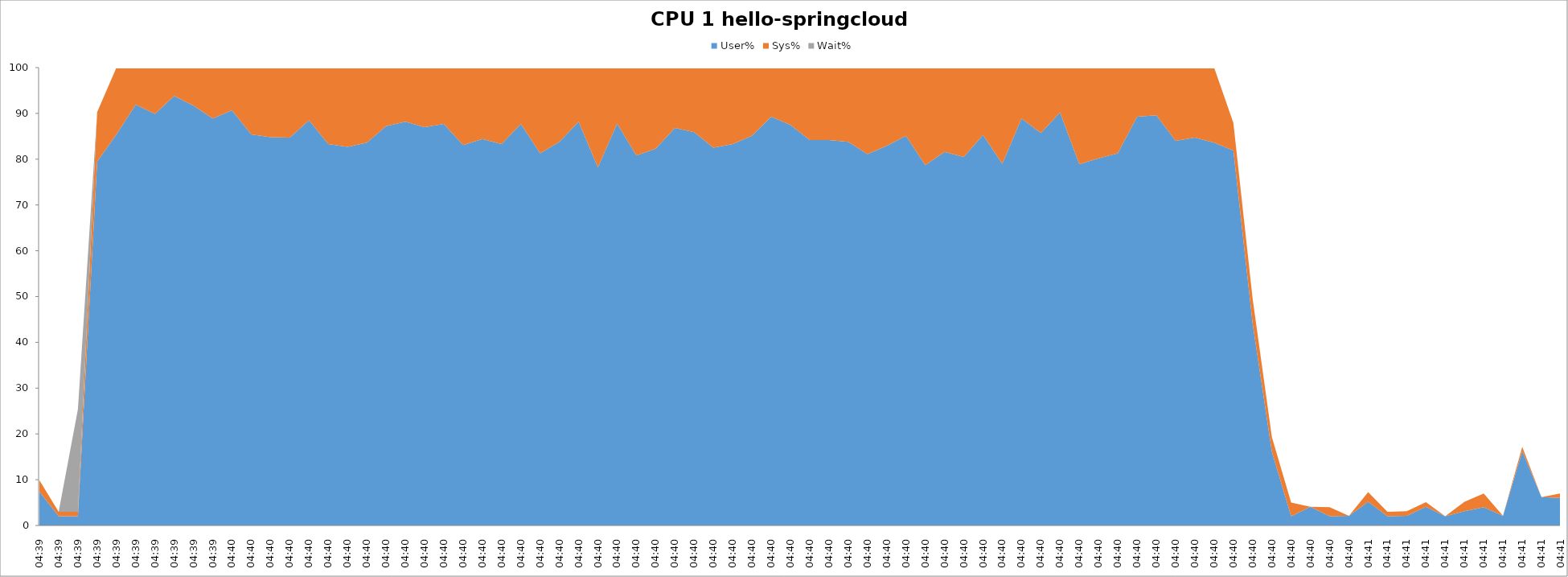
| Category | User% | Sys% | Wait% |
|---|---|---|---|
| 04:39 | 7.4 | 2.5 | 0 |
| 04:39 | 2 | 1 | 0 |
| 04:39 | 2 | 1 | 22.4 |
| 04:39 | 79.5 | 10.8 | 0 |
| 04:39 | 85.4 | 14.6 | 0 |
| 04:39 | 91.9 | 8.1 | 0 |
| 04:39 | 89.9 | 10.1 | 0 |
| 04:39 | 93.8 | 6.2 | 0 |
| 04:39 | 91.7 | 8.3 | 0 |
| 04:39 | 88.9 | 11.1 | 0 |
| 04:40 | 90.7 | 9.3 | 0 |
| 04:40 | 85.4 | 14.6 | 0 |
| 04:40 | 84.8 | 15.2 | 0 |
| 04:40 | 84.7 | 15.3 | 0 |
| 04:40 | 88.5 | 11.5 | 0 |
| 04:40 | 83.3 | 16.7 | 0 |
| 04:40 | 82.7 | 17.3 | 0 |
| 04:40 | 83.6 | 16.4 | 0 |
| 04:40 | 87.2 | 12.8 | 0 |
| 04:40 | 88.2 | 11.8 | 0 |
| 04:40 | 87 | 13 | 0 |
| 04:40 | 87.7 | 12.3 | 0 |
| 04:40 | 83.1 | 16.9 | 0 |
| 04:40 | 84.4 | 15.6 | 0 |
| 04:40 | 83.3 | 16.7 | 0 |
| 04:40 | 87.7 | 12.3 | 0 |
| 04:40 | 81.3 | 18.7 | 0 |
| 04:40 | 83.8 | 16.2 | 0 |
| 04:40 | 88.2 | 11.8 | 0 |
| 04:40 | 78.2 | 21.8 | 0 |
| 04:40 | 87.8 | 12.2 | 0 |
| 04:40 | 80.8 | 19.2 | 0 |
| 04:40 | 82.3 | 17.7 | 0 |
| 04:40 | 86.8 | 13.2 | 0 |
| 04:40 | 85.9 | 14.1 | 0 |
| 04:40 | 82.5 | 17.5 | 0 |
| 04:40 | 83.3 | 16.7 | 0 |
| 04:40 | 85.1 | 14.9 | 0 |
| 04:40 | 89.3 | 10.7 | 0 |
| 04:40 | 87.5 | 12.5 | 0 |
| 04:40 | 84.2 | 15.8 | 0 |
| 04:40 | 84.2 | 15.8 | 0 |
| 04:40 | 83.8 | 16.2 | 0 |
| 04:40 | 81.1 | 18.9 | 0 |
| 04:40 | 82.9 | 17.1 | 0 |
| 04:40 | 85.1 | 14.9 | 0 |
| 04:40 | 78.7 | 21.3 | 0 |
| 04:40 | 81.6 | 18.4 | 0 |
| 04:40 | 80.5 | 19.5 | 0 |
| 04:40 | 85.3 | 14.7 | 0 |
| 04:40 | 79 | 21 | 0 |
| 04:40 | 88.9 | 11.1 | 0 |
| 04:40 | 85.7 | 14.3 | 0 |
| 04:40 | 90.2 | 9.8 | 0 |
| 04:40 | 78.9 | 21.1 | 0 |
| 04:40 | 80.2 | 19.8 | 0 |
| 04:40 | 81.3 | 18.7 | 0 |
| 04:40 | 89.3 | 10.7 | 0 |
| 04:40 | 89.6 | 10.4 | 0 |
| 04:40 | 84 | 16 | 0 |
| 04:40 | 84.7 | 15.3 | 0 |
| 04:40 | 83.6 | 16.4 | 0 |
| 04:40 | 81.9 | 6 | 0 |
| 04:40 | 44.1 | 5.4 | 0 |
| 04:40 | 16.1 | 3.2 | 0 |
| 04:40 | 2 | 3 | 0 |
| 04:40 | 4.1 | 0 | 0 |
| 04:40 | 2 | 2 | 0 |
| 04:40 | 2.1 | 0 | 0 |
| 04:41 | 5.2 | 2.1 | 0 |
| 04:41 | 2 | 1 | 0 |
| 04:41 | 2.1 | 1 | 0 |
| 04:41 | 4.1 | 1 | 0 |
| 04:41 | 2 | 0 | 0 |
| 04:41 | 3.1 | 2.1 | 0 |
| 04:41 | 4 | 3 | 0 |
| 04:41 | 2.1 | 0 | 0 |
| 04:41 | 16.2 | 1 | 0 |
| 04:41 | 6.2 | 0 | 0 |
| 04:41 | 6 | 1 | 0 |